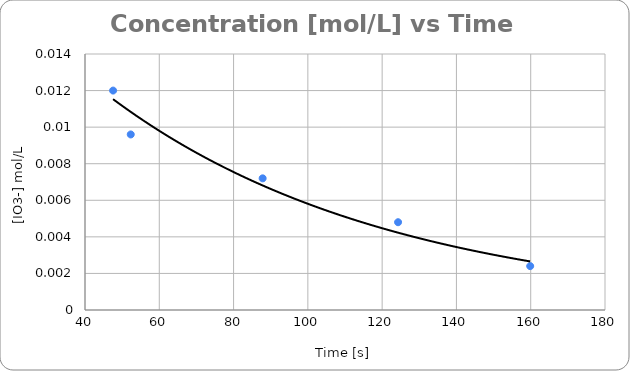
| Category | Concentration of IO3- |
|---|---|
| 47.56 | 0.012 |
| 52.32 | 0.01 |
| 87.83 | 0.007 |
| 124.29 | 0.005 |
| 159.86 | 0.002 |